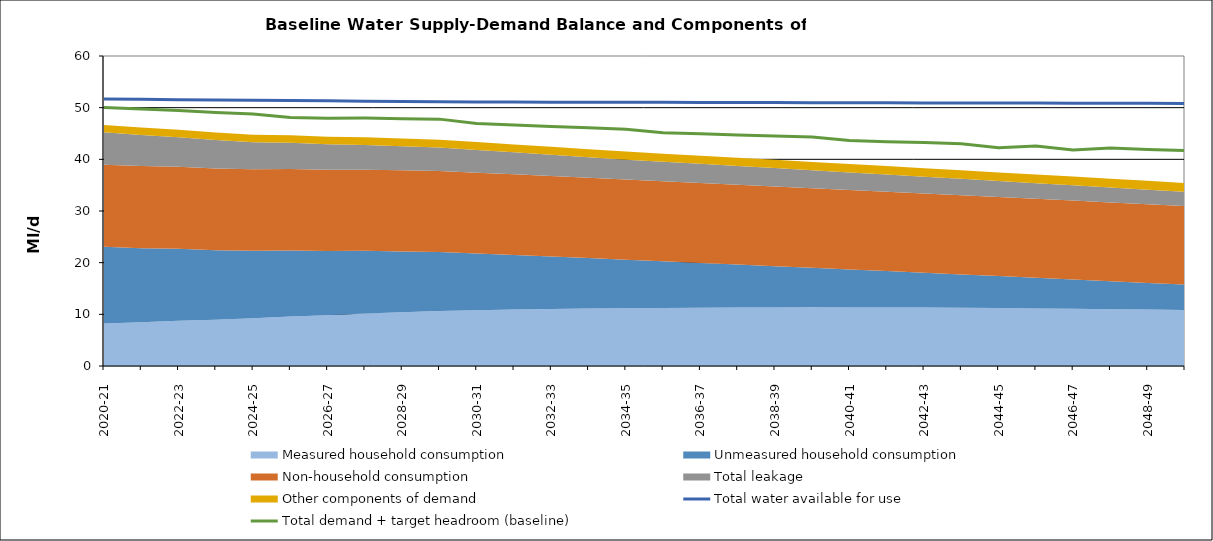
| Category | Total water available for use | Total demand + target headroom (baseline) |
|---|---|---|
| 0 | 51.668 | 50.03 |
| 1 | 51.609 | 49.728 |
| 2 | 51.551 | 49.43 |
| 3 | 51.493 | 49.052 |
| 4 | 51.434 | 48.769 |
| 5 | 51.376 | 48.102 |
| 6 | 51.318 | 47.969 |
| 7 | 51.26 | 47.988 |
| 8 | 51.201 | 47.873 |
| 9 | 51.143 | 47.782 |
| 10 | 51.099 | 46.948 |
| 11 | 51.085 | 46.649 |
| 12 | 51.07 | 46.365 |
| 13 | 51.056 | 46.107 |
| 14 | 51.041 | 45.84 |
| 15 | 51.027 | 45.165 |
| 16 | 51.012 | 44.941 |
| 17 | 50.997 | 44.728 |
| 18 | 50.983 | 44.521 |
| 19 | 50.968 | 44.32 |
| 20 | 50.954 | 43.627 |
| 21 | 50.939 | 43.401 |
| 22 | 50.925 | 43.248 |
| 23 | 50.91 | 43.001 |
| 24 | 50.896 | 42.256 |
| 25 | 50.881 | 42.602 |
| 26 | 50.866 | 41.802 |
| 27 | 50.852 | 42.176 |
| 28 | 50.837 | 41.91 |
| 29 | 50.823 | 41.697 |